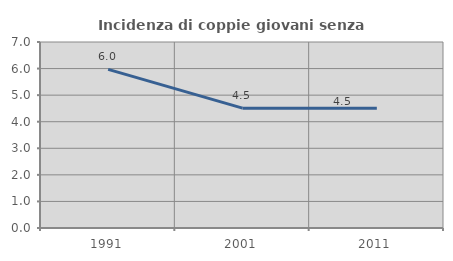
| Category | Incidenza di coppie giovani senza figli |
|---|---|
| 1991.0 | 5.968 |
| 2001.0 | 4.509 |
| 2011.0 | 4.511 |